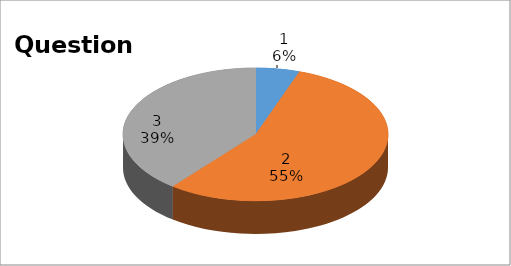
| Category | Series 0 |
|---|---|
| 0 | 3 |
| 1 | 31 |
| 2 | 22 |